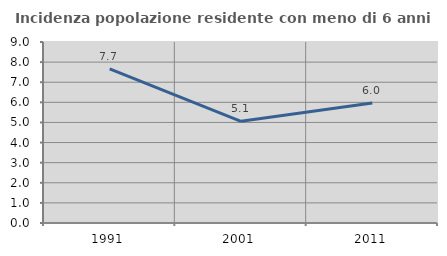
| Category | Incidenza popolazione residente con meno di 6 anni |
|---|---|
| 1991.0 | 7.669 |
| 2001.0 | 5.057 |
| 2011.0 | 5.97 |